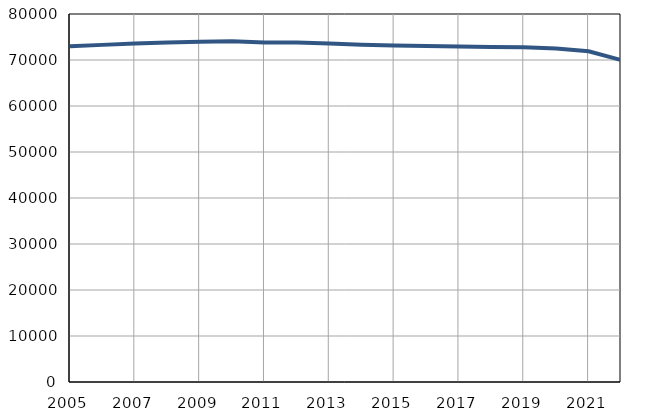
| Category | Population
size |
|---|---|
| 2005.0 | 72996 |
| 2006.0 | 73288 |
| 2007.0 | 73610 |
| 2008.0 | 73831 |
| 2009.0 | 73951 |
| 2010.0 | 74054 |
| 2011.0 | 73825 |
| 2012.0 | 73791 |
| 2013.0 | 73584 |
| 2014.0 | 73317 |
| 2015.0 | 73140 |
| 2016.0 | 73049 |
| 2017.0 | 72942 |
| 2018.0 | 72843 |
| 2019.0 | 72750 |
| 2020.0 | 72480 |
| 2021.0 | 71910 |
| 2022.0 | 69985 |